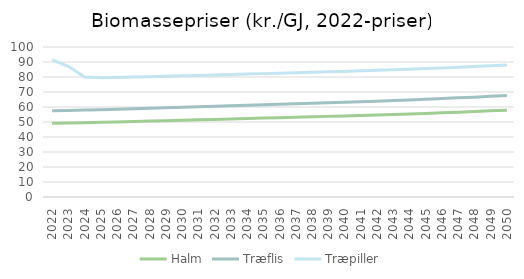
| Category | Halm | Træflis | Træpiller |
|---|---|---|---|
| 2022.0 | 49.15 | 57.42 | 91.38 |
| 2023.0 | 49.39 | 57.7 | 87.18 |
| 2024.0 | 49.58 | 57.92 | 79.96 |
| 2025.0 | 49.78 | 58.15 | 79.43 |
| 2026.0 | 50.04 | 58.46 | 79.68 |
| 2027.0 | 50.32 | 58.79 | 79.94 |
| 2028.0 | 50.61 | 59.12 | 80.22 |
| 2029.0 | 50.89 | 59.46 | 80.5 |
| 2030.0 | 51.18 | 59.79 | 80.78 |
| 2031.0 | 51.46 | 60.12 | 81.07 |
| 2032.0 | 51.74 | 60.45 | 81.36 |
| 2033.0 | 52.03 | 60.78 | 81.66 |
| 2034.0 | 52.31 | 61.11 | 81.96 |
| 2035.0 | 52.6 | 61.44 | 82.25 |
| 2036.0 | 52.88 | 61.78 | 82.55 |
| 2037.0 | 53.17 | 62.11 | 82.85 |
| 2038.0 | 53.46 | 62.45 | 83.14 |
| 2039.0 | 53.75 | 62.79 | 83.44 |
| 2040.0 | 54.03 | 63.12 | 83.74 |
| 2041.0 | 54.36 | 63.51 | 84.09 |
| 2042.0 | 54.7 | 63.9 | 84.46 |
| 2043.0 | 55.04 | 64.3 | 84.83 |
| 2044.0 | 55.38 | 64.7 | 85.21 |
| 2045.0 | 55.73 | 65.11 | 85.6 |
| 2046.0 | 56.15 | 65.59 | 86.05 |
| 2047.0 | 56.57 | 66.09 | 86.52 |
| 2048.0 | 57 | 66.58 | 86.99 |
| 2049.0 | 57.43 | 67.09 | 87.47 |
| 2050.0 | 57.87 | 67.6 | 87.96 |